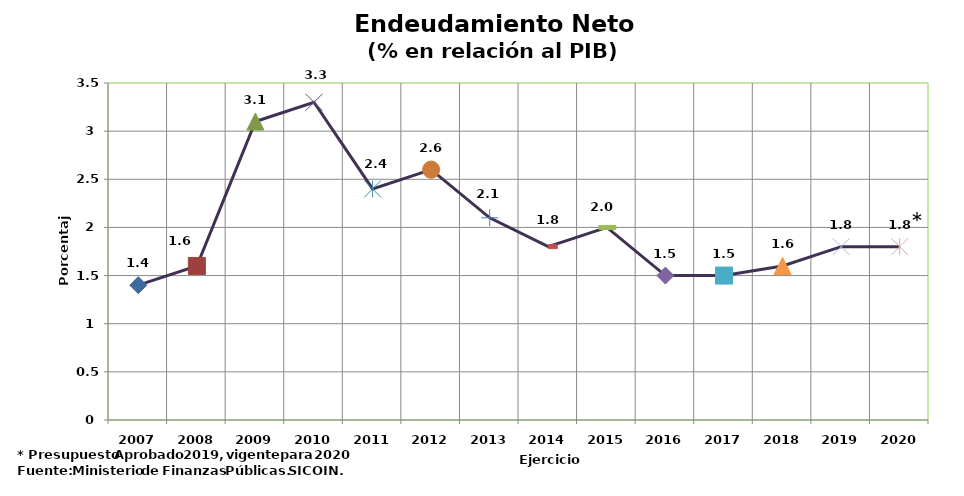
| Category | Series 0 |
|---|---|
| 2007 | 1.4 |
| 2008 | 1.6 |
| 2009 | 3.1 |
| 2010 | 3.3 |
| 2011 | 2.4 |
| 2012 | 2.6 |
| 2013 | 2.1 |
| 2014 | 1.8 |
| 2015 | 2 |
| 2016 | 1.5 |
| 2017 | 1.5 |
| 2018 | 1.6 |
| 2019 | 1.8 |
| 2020 | 1.8 |